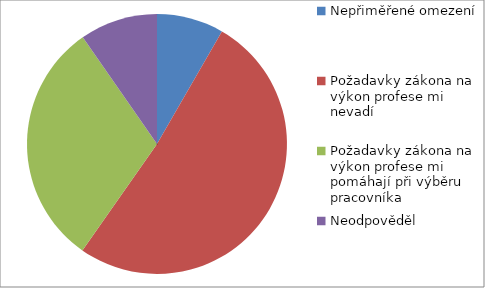
| Category | Series 0 |
|---|---|
| Nepřiměřené omezení  | 68 |
| Požadavky zákona na výkon profese mi nevadí | 420 |
| Požadavky zákona na výkon profese mi pomáhají při výběru pracovníka | 250 |
| Neodpověděl | 79 |